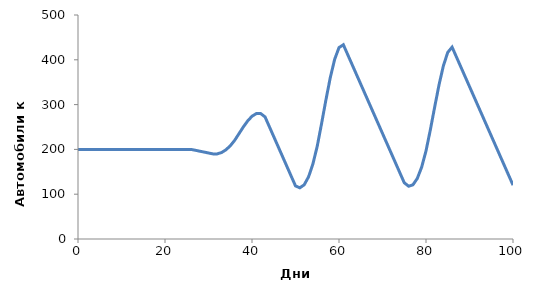
| Category | Запас автомобилей |
|---|---|
| 0.0 | 200 |
| 1.0 | 200 |
| 2.0 | 200 |
| 3.0 | 200 |
| 4.0 | 200 |
| 5.0 | 200 |
| 6.0 | 200 |
| 7.0 | 200 |
| 8.0 | 200 |
| 9.0 | 200 |
| 10.0 | 200 |
| 11.0 | 200 |
| 12.0 | 200 |
| 13.0 | 200 |
| 14.0 | 200 |
| 15.0 | 200 |
| 16.0 | 200 |
| 17.0 | 200 |
| 18.0 | 200 |
| 19.0 | 200 |
| 20.0 | 200 |
| 21.0 | 200 |
| 22.0 | 200 |
| 23.0 | 200 |
| 24.0 | 200 |
| 25.0 | 200 |
| 26.0 | 200 |
| 27.0 | 198 |
| 28.0 | 196 |
| 29.0 | 194 |
| 30.0 | 192 |
| 31.0 | 190 |
| 32.0 | 190 |
| 33.0 | 193 |
| 34.0 | 199 |
| 35.0 | 208 |
| 36.0 | 220 |
| 37.0 | 235 |
| 38.0 | 250 |
| 39.0 | 263.5 |
| 40.0 | 274 |
| 41.0 | 280 |
| 42.0 | 280 |
| 43.0 | 272.5 |
| 44.0 | 250.5 |
| 45.0 | 228.5 |
| 46.0 | 206.5 |
| 47.0 | 184.5 |
| 48.0 | 162.5 |
| 49.0 | 140.5 |
| 50.0 | 118.5 |
| 51.0 | 114.25 |
| 52.0 | 121 |
| 53.0 | 138.75 |
| 54.0 | 167.5 |
| 55.0 | 207.25 |
| 56.0 | 258 |
| 57.0 | 310.875 |
| 58.0 | 360.375 |
| 59.0 | 401 |
| 60.0 | 427.25 |
| 61.0 | 433.625 |
| 62.0 | 411.625 |
| 63.0 | 389.625 |
| 64.0 | 367.625 |
| 65.0 | 345.625 |
| 66.0 | 323.625 |
| 67.0 | 301.625 |
| 68.0 | 279.625 |
| 69.0 | 257.625 |
| 70.0 | 235.625 |
| 71.0 | 213.625 |
| 72.0 | 191.625 |
| 73.0 | 169.625 |
| 74.0 | 147.625 |
| 75.0 | 125.625 |
| 76.0 | 117.812 |
| 77.0 | 121 |
| 78.0 | 135.188 |
| 79.0 | 160.375 |
| 80.0 | 196.562 |
| 81.0 | 243.75 |
| 82.0 | 294.844 |
| 83.0 | 344.344 |
| 84.0 | 386.75 |
| 85.0 | 416.562 |
| 86.0 | 428.281 |
| 87.0 | 406.281 |
| 88.0 | 384.281 |
| 89.0 | 362.281 |
| 90.0 | 340.281 |
| 91.0 | 318.281 |
| 92.0 | 296.281 |
| 93.0 | 274.281 |
| 94.0 | 252.281 |
| 95.0 | 230.281 |
| 96.0 | 208.281 |
| 97.0 | 186.281 |
| 98.0 | 164.281 |
| 99.0 | 142.281 |
| 100.0 | 120.281 |